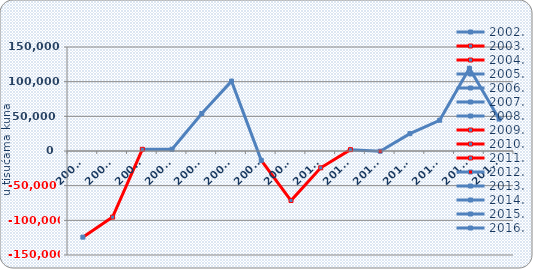
| Category | Neto dobit/gubitak |
|---|---|
| 2002. | -124230.997 |
| 2003. | -95344.036 |
| 2004. | 2436.128 |
| 2005. | 2570.111 |
| 2006. | 54067.607 |
| 2007. | 100801.461 |
| 2008. | -13516.351 |
| 2009. | -71435.126 |
| 2010. | -24239.572 |
| 2011. | 1954.712 |
| 2012. | -299.182 |
| 2013. | 25029.006 |
| 2014. | 44359.392 |
| 2015. | 119271.921 |
| 2016. | 46028.074 |